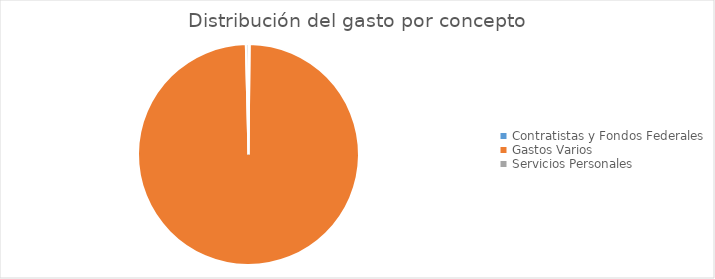
| Category | Series 0 |
|---|---|
| Contratistas y Fondos Federales | 301208.08 |
| Gastos Varios | 183988413.66 |
| Servicios Personales | 711559.99 |